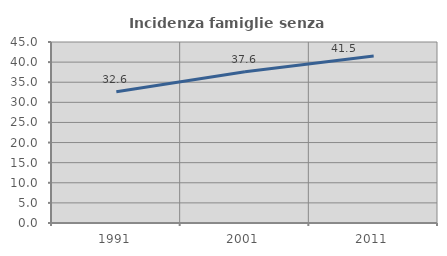
| Category | Incidenza famiglie senza nuclei |
|---|---|
| 1991.0 | 32.626 |
| 2001.0 | 37.614 |
| 2011.0 | 41.547 |